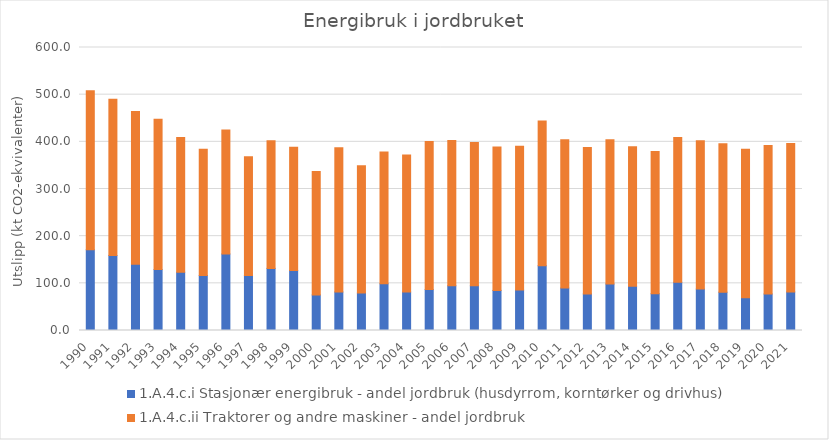
| Category | 1.A.4.c.i Stasjonær energibruk - andel jordbruk (husdyrrom, korntørker og drivhus) | 1.A.4.c.ii Traktorer og andre maskiner - andel jordbruk |
|---|---|---|
| 1990.0 | 171.261 | 337.006 |
| 1991.0 | 159.167 | 331.307 |
| 1992.0 | 140.3 | 323.842 |
| 1993.0 | 129.318 | 318.717 |
| 1994.0 | 123.557 | 285.811 |
| 1995.0 | 116.636 | 267.49 |
| 1996.0 | 162.189 | 263.041 |
| 1997.0 | 116.588 | 251.935 |
| 1998.0 | 131.707 | 270.679 |
| 1999.0 | 127.334 | 261.206 |
| 2000.0 | 75.462 | 261.82 |
| 2001.0 | 81.712 | 305.509 |
| 2002.0 | 79.254 | 270.285 |
| 2003.0 | 98.999 | 279.3 |
| 2004.0 | 81.523 | 290.734 |
| 2005.0 | 86.888 | 313.799 |
| 2006.0 | 94.794 | 308.02 |
| 2007.0 | 95.011 | 303.412 |
| 2008.0 | 84.962 | 303.947 |
| 2009.0 | 85.661 | 305.078 |
| 2010.0 | 137.305 | 306.779 |
| 2011.0 | 89.929 | 314.705 |
| 2012.0 | 77.637 | 310.239 |
| 2013.0 | 98.668 | 305.594 |
| 2014.0 | 93.859 | 295.772 |
| 2015.0 | 78.018 | 301.431 |
| 2016.0 | 102.236 | 307.149 |
| 2017.0 | 87.816 | 314.722 |
| 2018.0 | 81.295 | 314.459 |
| 2019.0 | 69.589 | 314.579 |
| 2020.0 | 77.433 | 314.727 |
| 2021.0 | 81.704 | 314.727 |